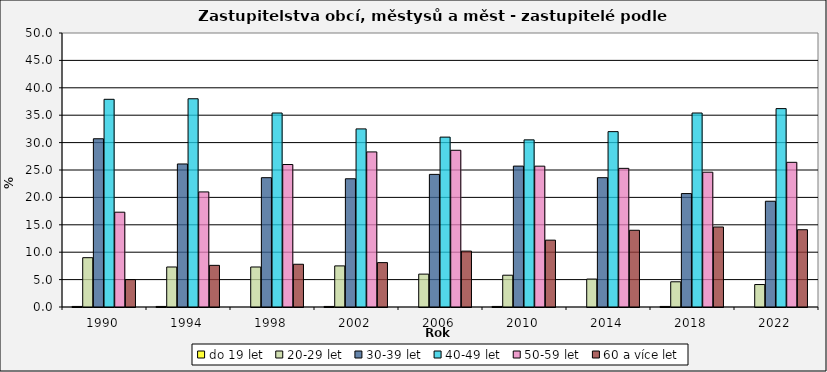
| Category | do 19 let | 20-29 let | 30-39 let | 40-49 let | 50-59 let | 60 a více let |
|---|---|---|---|---|---|---|
| 1990.0 | 0.1 | 9 | 30.7 | 37.9 | 17.3 | 5 |
| 1994.0 | 0.1 | 7.3 | 26.1 | 38 | 21 | 7.6 |
| 1998.0 | 0 | 7.3 | 23.6 | 35.4 | 26 | 7.8 |
| 2002.0 | 0.1 | 7.5 | 23.4 | 32.5 | 28.3 | 8.1 |
| 2006.0 | 0 | 6 | 24.2 | 31 | 28.6 | 10.2 |
| 2010.0 | 0.1 | 5.8 | 25.71 | 30.5 | 25.7 | 12.2 |
| 2014.0 | 0 | 5.1 | 23.6 | 32 | 25.3 | 14 |
| 2018.0 | 0.1 | 4.6 | 20.7 | 35.4 | 24.6 | 14.6 |
| 2022.0 | 0 | 4.1 | 19.3 | 36.2 | 26.4 | 14.1 |